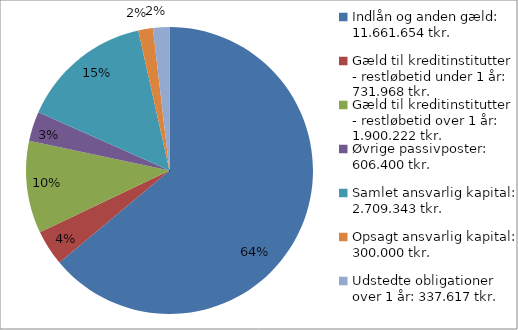
| Category | Series 0 |
|---|---|
| Indlån og anden gæld: 11.661.654 tkr.  | 11661654 |
| Gæld til kreditinstitutter - restløbetid under 1 år: 731.968 tkr. | 731968 |
| Gæld til kreditinstitutter - restløbetid over 1 år: 1.900.222 tkr. | 1900222 |
| Øvrige passivposter: 606.400 tkr. | 606400 |
| Samlet ansvarlig kapital: 2.709.343 tkr.  | 2709343 |
| Opsagt ansvarlig kapital: 300.000 tkr.  | 300000 |
| Udstedte obligationer over 1 år: 337.617 tkr.  | 337617 |